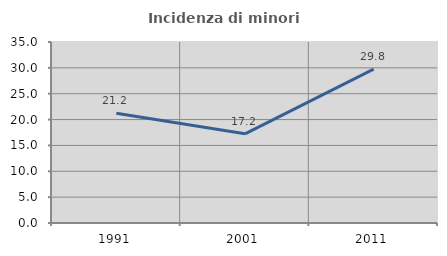
| Category | Incidenza di minori stranieri |
|---|---|
| 1991.0 | 21.212 |
| 2001.0 | 17.241 |
| 2011.0 | 29.767 |